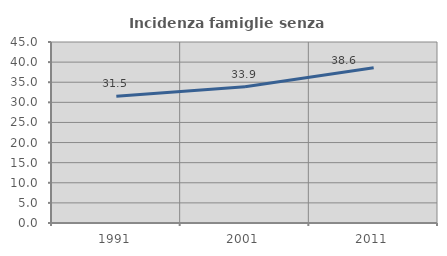
| Category | Incidenza famiglie senza nuclei |
|---|---|
| 1991.0 | 31.487 |
| 2001.0 | 33.864 |
| 2011.0 | 38.578 |